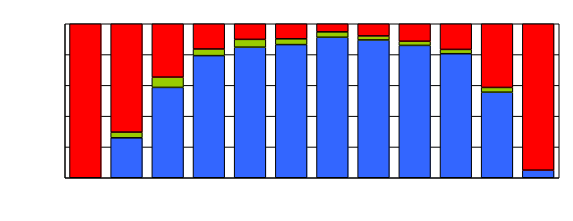
| Category | Series 0 | Series 1 | Series 2 |
|---|---|---|---|
| 0 | 0 | 0 | 268 |
| 1 | 21 | 3 | 57 |
| 2 | 44 | 5 | 26 |
| 3 | 92 | 5 | 19 |
| 4 | 117 | 7 | 14 |
| 5 | 115 | 5 | 13 |
| 6 | 104 | 4 | 6 |
| 7 | 136 | 4 | 12 |
| 8 | 159 | 5 | 21 |
| 9 | 145 | 5 | 30 |
| 10 | 90 | 5 | 67 |
| 11 | 25 | 0 | 481 |